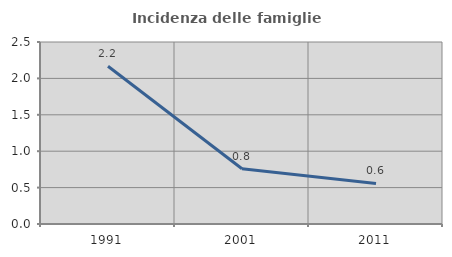
| Category | Incidenza delle famiglie numerose |
|---|---|
| 1991.0 | 2.166 |
| 2001.0 | 0.758 |
| 2011.0 | 0.558 |